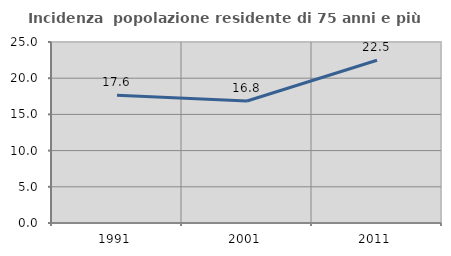
| Category | Incidenza  popolazione residente di 75 anni e più |
|---|---|
| 1991.0 | 17.647 |
| 2001.0 | 16.847 |
| 2011.0 | 22.475 |